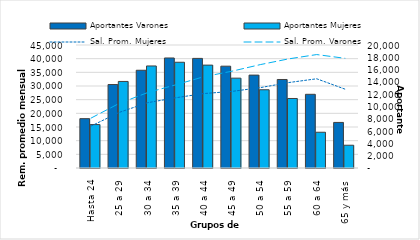
| Category | Aportantes Varones | Aportantes Mujeres |
|---|---|---|
| Hasta 24 | 8023 | 7062 |
| 25 a 29 | 13570 | 14075 |
| 30 a 34 | 15893 | 16591 |
| 35 a 39 | 17890 | 17193 |
| 40 a 44 | 17822 | 16729 |
| 45 a 49 | 16557 | 14610 |
| 50 a 54 | 15106 | 12723 |
| 55 a 59 | 14392 | 11302 |
| 60 a 64 | 11983 | 5814 |
| 65 y más | 7411 | 3703 |